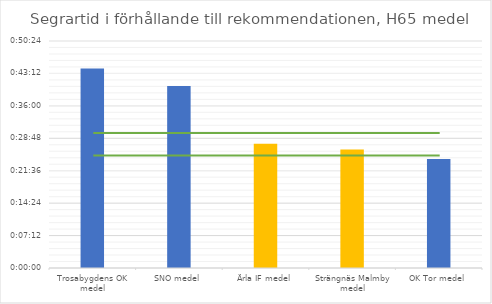
| Category | H65 tid |
|---|---|
| Trosabygdens OK medel | 0.031 |
| SNO medel | 0.028 |
| Ärla IF medel | 0.019 |
| Strängnäs Malmby medel | 0.018 |
| OK Tor medel | 0.017 |